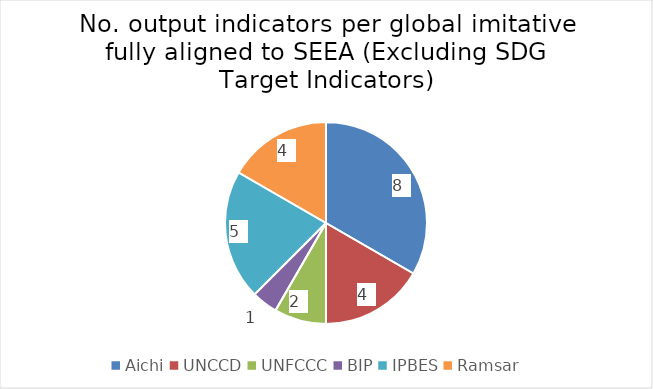
| Category | Series 0 |
|---|---|
| Aichi | 8 |
| UNCCD | 4 |
| UNFCCC | 2 |
| BIP | 1 |
| IPBES | 5 |
| Ramsar | 4 |